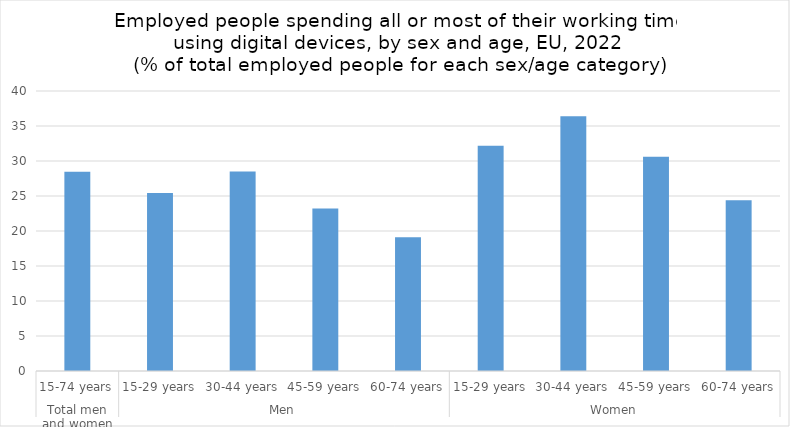
| Category | Series 0 |
|---|---|
| 0 | 28.472 |
| 1 | 25.429 |
| 2 | 28.518 |
| 3 | 23.216 |
| 4 | 19.117 |
| 5 | 32.183 |
| 6 | 36.409 |
| 7 | 30.603 |
| 8 | 24.389 |